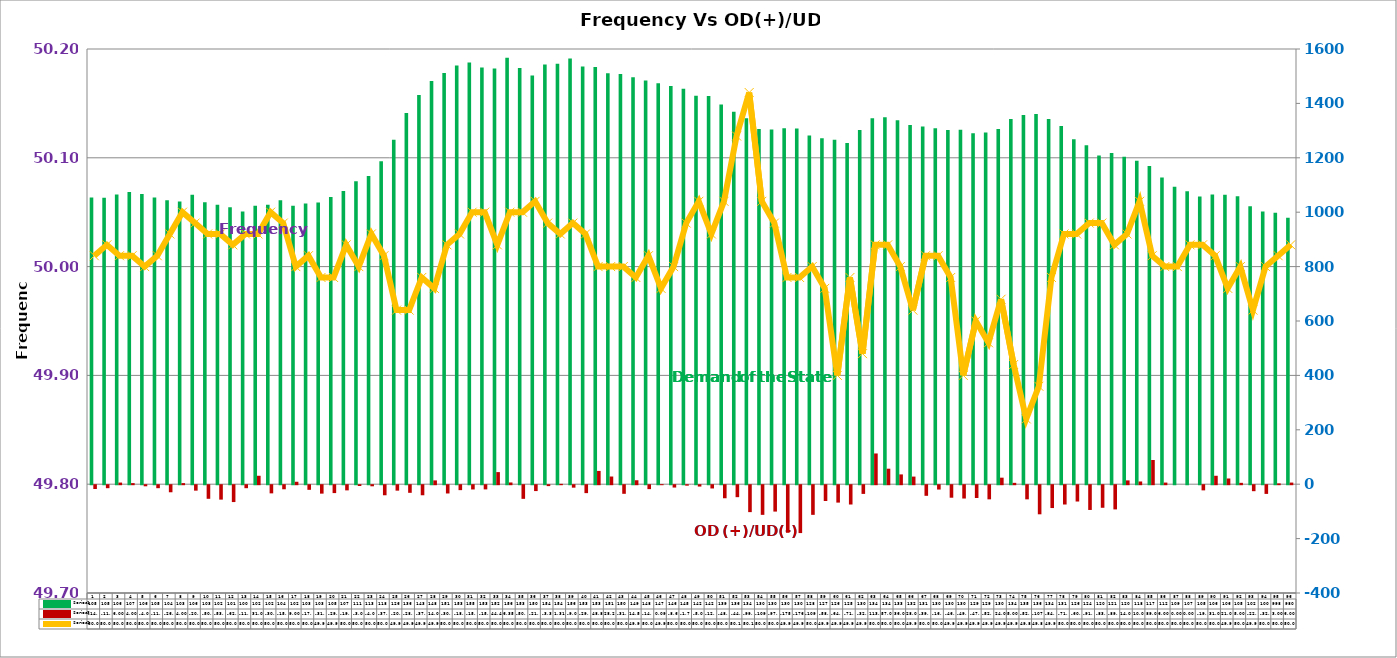
| Category | Series 2 | Series 4 |
|---|---|---|
| 0 | 1054 | -14 |
| 1 | 1053 | -11 |
| 2 | 1065 | 6 |
| 3 | 1074 | 4 |
| 4 | 1067 | -4 |
| 5 | 1054 | -11 |
| 6 | 1044 | -26 |
| 7 | 1039 | 4 |
| 8 | 1064 | -20 |
| 9 | 1037 | -50 |
| 10 | 1027 | -53 |
| 11 | 1018 | -62 |
| 12 | 1003 | -11 |
| 13 | 1024 | 31 |
| 14 | 1027 | -30 |
| 15 | 1044 | -15 |
| 16 | 1024 | 9 |
| 17 | 1032 | -17 |
| 18 | 1036 | -31 |
| 19 | 1056 | -29 |
| 20 | 1078 | -19 |
| 21 | 1114 | -3 |
| 22 | 1133 | -4 |
| 23 | 1187 | -37 |
| 24 | 1266 | -20 |
| 25 | 1365 | -28 |
| 26 | 1431 | -37 |
| 27 | 1482 | 14 |
| 28 | 1512 | -30.426 |
| 29 | 1539 | -18.155 |
| 30 | 1550 | -15.656 |
| 31 | 1532 | -15.452 |
| 32 | 1528 | 44.492 |
| 33 | 1568 | 6.349 |
| 34 | 1530 | -50.17 |
| 35 | 1503 | -21.574 |
| 36 | 1543 | -3.347 |
| 37 | 1546 | 1.309 |
| 38 | 1565 | -9.068 |
| 39 | 1536 | -29.148 |
| 40 | 1534 | 48.801 |
| 41 | 1511 | 28.244 |
| 42 | 1508 | -31.623 |
| 43 | 1496 | 14.52 |
| 44 | 1484 | -14.458 |
| 45 | 1474 | 0.09 |
| 46 | 1464 | -8.637 |
| 47 | 1454 | -1.769 |
| 48 | 1428.333 | -5 |
| 49 | 1427 | -12 |
| 50 | 1396 | -48 |
| 51 | 1369 | -44 |
| 52 | 1345 | -99 |
| 53 | 1305.667 | -109 |
| 54 | 1304 | -97 |
| 55 | 1309 | -175 |
| 56 | 1308 | -176 |
| 57 | 1282 | -109 |
| 58 | 1272 | -58 |
| 59 | 1266 | -64 |
| 60 | 1254 | -71 |
| 61 | 1302 | -32 |
| 62 | 1345 | 113 |
| 63 | 1349 | 57 |
| 64 | 1338 | 36 |
| 65 | 1321 | 28 |
| 66 | 1315 | -39 |
| 67 | 1309 | -16 |
| 68 | 1302 | -46 |
| 69 | 1303 | -49 |
| 70 | 1290 | -47 |
| 71 | 1293 | -52 |
| 72 | 1306 | 24 |
| 73 | 1343 | 5 |
| 74 | 1357 | -52 |
| 75 | 1361 | -107 |
| 76 | 1343 | -84 |
| 77 | 1317 | -71 |
| 78 | 1268 | -60 |
| 79 | 1246 | -91 |
| 80 | 1208 | -83 |
| 81 | 1218 | -89 |
| 82 | 1204 | 14 |
| 83 | 1189 | 10 |
| 84 | 1170 | 89 |
| 85 | 1128 | 6 |
| 86 | 1094 | 0 |
| 87 | 1077 | 0 |
| 88 | 1058 | -19 |
| 89 | 1065 | 31 |
| 90 | 1064 | 21 |
| 91 | 1059 | 5 |
| 92 | 1022 | -22 |
| 93 | 1003 | -32 |
| 94 | 998 | 3 |
| 95 | 980 | 6 |